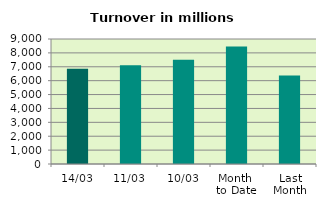
| Category | Series 0 |
|---|---|
| 14/03 | 6858.83 |
| 11/03 | 7105.458 |
| 10/03 | 7513.563 |
| Month 
to Date | 8451.463 |
| Last
Month | 6378.947 |